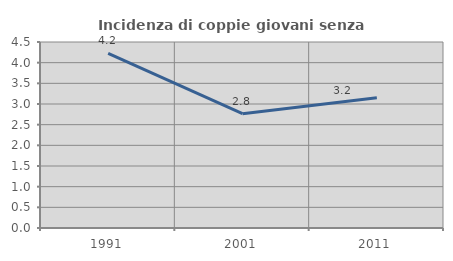
| Category | Incidenza di coppie giovani senza figli |
|---|---|
| 1991.0 | 4.225 |
| 2001.0 | 2.765 |
| 2011.0 | 3.153 |